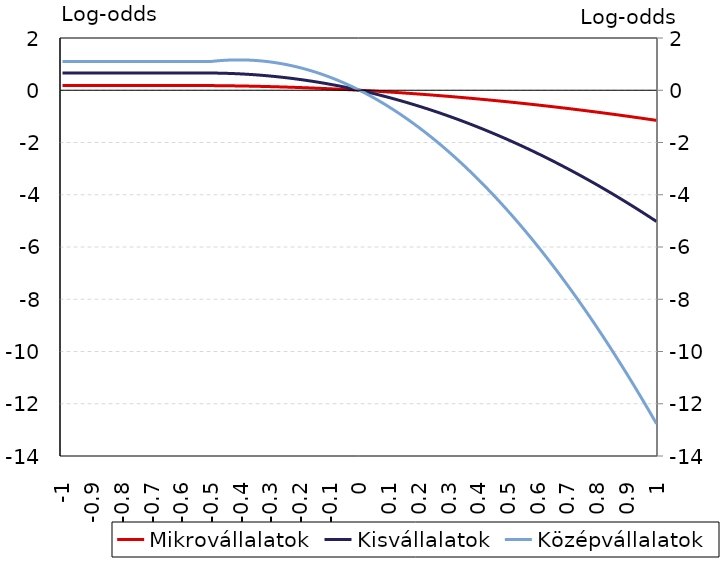
| Category | Mikrovállalatok | Kisvállalatok |
|---|---|---|
| -1.0 | 0.178 | 0.659 |
| -0.99 | 0.178 | 0.659 |
| -0.98 | 0.178 | 0.659 |
| -0.97 | 0.178 | 0.659 |
| -0.96 | 0.178 | 0.659 |
| -0.95 | 0.178 | 0.659 |
| -0.94 | 0.178 | 0.659 |
| -0.93 | 0.178 | 0.659 |
| -0.92 | 0.178 | 0.659 |
| -0.91 | 0.178 | 0.659 |
| -0.9 | 0.178 | 0.659 |
| -0.89 | 0.178 | 0.659 |
| -0.88 | 0.178 | 0.659 |
| -0.87 | 0.178 | 0.659 |
| -0.86 | 0.178 | 0.659 |
| -0.85 | 0.178 | 0.659 |
| -0.84 | 0.178 | 0.659 |
| -0.83 | 0.178 | 0.659 |
| -0.82 | 0.178 | 0.659 |
| -0.81 | 0.178 | 0.659 |
| -0.8 | 0.178 | 0.659 |
| -0.79 | 0.178 | 0.659 |
| -0.78 | 0.178 | 0.659 |
| -0.77 | 0.178 | 0.659 |
| -0.76 | 0.178 | 0.659 |
| -0.75 | 0.178 | 0.659 |
| -0.74 | 0.178 | 0.659 |
| -0.73 | 0.178 | 0.659 |
| -0.72 | 0.178 | 0.659 |
| -0.71 | 0.178 | 0.659 |
| -0.7 | 0.178 | 0.659 |
| -0.69 | 0.178 | 0.659 |
| -0.68 | 0.178 | 0.659 |
| -0.67 | 0.178 | 0.659 |
| -0.66 | 0.178 | 0.659 |
| -0.65 | 0.178 | 0.659 |
| -0.64 | 0.178 | 0.659 |
| -0.63 | 0.178 | 0.659 |
| -0.62 | 0.178 | 0.659 |
| -0.61 | 0.178 | 0.659 |
| -0.6 | 0.178 | 0.659 |
| -0.59 | 0.178 | 0.659 |
| -0.58 | 0.178 | 0.659 |
| -0.57 | 0.178 | 0.659 |
| -0.56 | 0.178 | 0.659 |
| -0.55 | 0.178 | 0.659 |
| -0.54 | 0.178 | 0.659 |
| -0.53 | 0.178 | 0.659 |
| -0.52 | 0.178 | 0.659 |
| -0.51 | 0.178 | 0.659 |
| -0.5 | 0.178 | 0.659 |
| -0.49 | 0.177 | 0.657 |
| -0.48 | 0.176 | 0.656 |
| -0.47 | 0.175 | 0.654 |
| -0.46 | 0.174 | 0.651 |
| -0.45 | 0.172 | 0.648 |
| -0.44 | 0.171 | 0.645 |
| -0.429999999999999 | 0.169 | 0.641 |
| -0.419999999999999 | 0.167 | 0.636 |
| -0.409999999999999 | 0.166 | 0.631 |
| -0.399999999999999 | 0.164 | 0.626 |
| -0.389999999999999 | 0.162 | 0.62 |
| -0.379999999999999 | 0.16 | 0.613 |
| -0.369999999999999 | 0.157 | 0.606 |
| -0.359999999999999 | 0.155 | 0.599 |
| -0.349999999999999 | 0.153 | 0.591 |
| -0.339999999999999 | 0.15 | 0.582 |
| -0.329999999999999 | 0.147 | 0.573 |
| -0.319999999999999 | 0.145 | 0.564 |
| -0.309999999999999 | 0.142 | 0.554 |
| -0.299999999999999 | 0.139 | 0.543 |
| -0.289999999999999 | 0.136 | 0.532 |
| -0.279999999999999 | 0.132 | 0.521 |
| -0.269999999999999 | 0.129 | 0.509 |
| -0.259999999999999 | 0.126 | 0.497 |
| -0.249999999999999 | 0.122 | 0.484 |
| -0.239999999999999 | 0.119 | 0.47 |
| -0.229999999999999 | 0.115 | 0.456 |
| -0.219999999999999 | 0.111 | 0.442 |
| -0.209999999999999 | 0.107 | 0.427 |
| -0.199999999999999 | 0.103 | 0.412 |
| -0.189999999999999 | 0.099 | 0.396 |
| -0.179999999999999 | 0.095 | 0.379 |
| -0.169999999999999 | 0.09 | 0.363 |
| -0.159999999999999 | 0.086 | 0.345 |
| -0.149999999999999 | 0.081 | 0.327 |
| -0.139999999999999 | 0.077 | 0.309 |
| -0.129999999999999 | 0.072 | 0.29 |
| -0.119999999999999 | 0.067 | 0.271 |
| -0.109999999999999 | 0.062 | 0.251 |
| -0.099999999999999 | 0.057 | 0.231 |
| -0.089999999999999 | 0.052 | 0.21 |
| -0.079999999999999 | 0.046 | 0.188 |
| -0.069999999999999 | 0.041 | 0.167 |
| -0.0599999999999991 | 0.035 | 0.144 |
| -0.049999999999999 | 0.03 | 0.121 |
| -0.039999999999999 | 0.024 | 0.098 |
| -0.029999999999999 | 0.018 | 0.074 |
| -0.019999999999999 | 0.012 | 0.05 |
| -0.00999999999999901 | 0.006 | 0.025 |
| 0.0 | 0 | 0 |
| 0.01 | -0.006 | -0.026 |
| 0.02 | -0.013 | -0.052 |
| 0.03 | -0.019 | -0.079 |
| 0.04 | -0.026 | -0.106 |
| 0.05 | -0.032 | -0.134 |
| 0.0600000000000001 | -0.039 | -0.162 |
| 0.0700000000000001 | -0.046 | -0.191 |
| 0.0800000000000001 | -0.053 | -0.22 |
| 0.0900000000000001 | -0.06 | -0.25 |
| 0.1 | -0.068 | -0.28 |
| 0.11 | -0.075 | -0.311 |
| 0.12 | -0.082 | -0.342 |
| 0.13 | -0.09 | -0.374 |
| 0.14 | -0.097 | -0.406 |
| 0.15 | -0.105 | -0.438 |
| 0.16 | -0.113 | -0.472 |
| 0.17 | -0.121 | -0.505 |
| 0.18 | -0.129 | -0.539 |
| 0.19 | -0.137 | -0.574 |
| 0.2 | -0.146 | -0.609 |
| 0.21 | -0.154 | -0.645 |
| 0.22 | -0.163 | -0.681 |
| 0.23 | -0.171 | -0.718 |
| 0.24 | -0.18 | -0.755 |
| 0.25 | -0.189 | -0.793 |
| 0.26 | -0.198 | -0.831 |
| 0.27 | -0.207 | -0.869 |
| 0.28 | -0.216 | -0.908 |
| 0.29 | -0.225 | -0.948 |
| 0.3 | -0.234 | -0.988 |
| 0.31 | -0.244 | -1.029 |
| 0.32 | -0.253 | -1.07 |
| 0.33 | -0.263 | -1.111 |
| 0.34 | -0.273 | -1.153 |
| 0.35 | -0.283 | -1.196 |
| 0.36 | -0.293 | -1.239 |
| 0.37 | -0.303 | -1.283 |
| 0.38 | -0.313 | -1.327 |
| 0.39 | -0.323 | -1.371 |
| 0.4 | -0.334 | -1.416 |
| 0.41 | -0.344 | -1.462 |
| 0.42 | -0.355 | -1.508 |
| 0.43 | -0.366 | -1.554 |
| 0.44 | -0.377 | -1.601 |
| 0.45 | -0.388 | -1.649 |
| 0.46 | -0.399 | -1.697 |
| 0.47 | -0.41 | -1.745 |
| 0.48 | -0.421 | -1.794 |
| 0.49 | -0.432 | -1.844 |
| 0.5 | -0.444 | -1.894 |
| 0.51 | -0.455 | -1.944 |
| 0.52 | -0.467 | -1.995 |
| 0.53 | -0.479 | -2.047 |
| 0.54 | -0.491 | -2.099 |
| 0.55 | -0.503 | -2.151 |
| 0.56 | -0.515 | -2.204 |
| 0.57 | -0.527 | -2.258 |
| 0.58 | -0.54 | -2.312 |
| 0.59 | -0.552 | -2.366 |
| 0.6 | -0.565 | -2.421 |
| 0.61 | -0.577 | -2.476 |
| 0.62 | -0.59 | -2.532 |
| 0.63 | -0.603 | -2.589 |
| 0.64 | -0.616 | -2.646 |
| 0.65 | -0.629 | -2.703 |
| 0.66 | -0.642 | -2.761 |
| 0.67 | -0.655 | -2.819 |
| 0.68 | -0.669 | -2.878 |
| 0.69 | -0.682 | -2.938 |
| 0.7 | -0.696 | -2.997 |
| 0.71 | -0.71 | -3.058 |
| 0.72 | -0.723 | -3.119 |
| 0.73 | -0.737 | -3.18 |
| 0.74 | -0.751 | -3.242 |
| 0.75 | -0.766 | -3.304 |
| 0.76 | -0.78 | -3.367 |
| 0.77 | -0.794 | -3.43 |
| 0.78 | -0.809 | -3.494 |
| 0.79 | -0.823 | -3.558 |
| 0.8 | -0.838 | -3.623 |
| 0.81 | -0.853 | -3.689 |
| 0.82 | -0.868 | -3.754 |
| 0.83 | -0.883 | -3.821 |
| 0.84 | -0.898 | -3.887 |
| 0.85 | -0.913 | -3.955 |
| 0.86 | -0.928 | -4.022 |
| 0.87 | -0.944 | -4.091 |
| 0.88 | -0.959 | -4.16 |
| 0.89 | -0.975 | -4.229 |
| 0.9 | -0.99 | -4.299 |
| 0.91 | -1.006 | -4.369 |
| 0.92 | -1.022 | -4.44 |
| 0.93 | -1.038 | -4.511 |
| 0.94 | -1.054 | -4.582 |
| 0.95 | -1.071 | -4.655 |
| 0.96 | -1.087 | -4.727 |
| 0.97 | -1.104 | -4.801 |
| 0.98 | -1.12 | -4.874 |
| 0.99 | -1.137 | -4.949 |
| 1.0 | -1.154 | -5.023 |